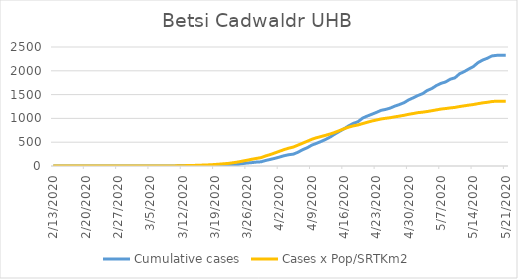
| Category | Cumulative cases | Cases x Pop/SRTKm2 |
|---|---|---|
| 5/21/20 | 2327 | 1361.976 |
| 5/20/20 | 2327 | 1361.976 |
| 5/19/20 | 2324 | 1361.656 |
| 5/18/20 | 2312 | 1354.191 |
| 5/17/20 | 2263 | 1338.301 |
| 5/16/20 | 2225 | 1326.463 |
| 5/15/20 | 2171 | 1309.826 |
| 5/14/20 | 2089 | 1291.377 |
| 5/13/20 | 2038 | 1278.579 |
| 5/12/20 | 1982 | 1263.862 |
| 5/11/20 | 1937 | 1249.251 |
| 5/10/20 | 1852 | 1231.122 |
| 5/9/20 | 1824 | 1220.564 |
| 5/8/20 | 1766 | 1207.34 |
| 5/7/20 | 1737 | 1196.675 |
| 5/6/20 | 1691 | 1179.078 |
| 5/5/20 | 1628 | 1161.482 |
| 5/4/20 | 1586 | 1144.525 |
| 5/3/20 | 1520 | 1130.874 |
| 5/2/20 | 1481 | 1120.85 |
| 5/1/20 | 1434 | 1103.04 |
| 4/30/20 | 1390 | 1086.19 |
| 4/29/20 | 1331 | 1065.714 |
| 4/28/20 | 1292 | 1048.33 |
| 4/27/20 | 1259 | 1032.76 |
| 4/26/20 | 1217 | 1015.27 |
| 4/25/20 | 1189 | 1002.579 |
| 4/24/20 | 1169 | 988.182 |
| 4/23/20 | 1126 | 966.106 |
| 4/22/20 | 1087 | 944.99 |
| 4/21/20 | 1049 | 918.222 |
| 4/20/20 | 1006 | 891.241 |
| 4/19/20 | 930 | 861.913 |
| 4/18/20 | 896 | 842.93 |
| 4/17/20 | 844 | 817.015 |
| 4/16/20 | 783 | 782.675 |
| 4/15/20 | 727 | 744.389 |
| 4/14/20 | 672 | 706.53 |
| 4/13/20 | 610 | 673.47 |
| 4/12/20 | 558 | 644.995 |
| 4/11/20 | 515 | 619.08 |
| 4/10/20 | 475 | 593.059 |
| 4/9/20 | 439 | 561.065 |
| 4/8/20 | 383 | 519.473 |
| 4/7/20 | 342 | 478.627 |
| 4/6/20 | 289 | 438.528 |
| 4/5/20 | 249 | 398.11 |
| 4/4/20 | 237 | 374.541 |
| 4/3/20 | 216 | 344.573 |
| 4/2/20 | 188 | 310.02 |
| 4/1/20 | 161 | 274.507 |
| 3/31/20 | 138 | 240.38 |
| 3/30/20 | 116 | 211.479 |
| 3/29/20 | 88 | 175.859 |
| 3/28/20 | 82 | 159.223 |
| 3/27/20 | 71 | 141.519 |
| 3/26/20 | 63 | 121.79 |
| 3/25/20 | 50 | 103.233 |
| 3/24/20 | 32 | 83.717 |
| 3/23/20 | 22 | 69.32 |
| 3/22/20 | 20 | 55.456 |
| 3/21/20 | 16 | 47.351 |
| 3/20/20 | 12 | 39.352 |
| 3/19/20 | 11 | 31.674 |
| 3/18/20 | 9 | 25.275 |
| 3/17/20 | 7 | 21.542 |
| 3/16/20 | 7 | 17.597 |
| 3/15/20 | 6 | 13.971 |
| 3/14/20 | 6 | 10.878 |
| 3/13/20 | 4 | 8.852 |
| 3/12/20 | 4 | 5.972 |
| 3/11/20 | 3 | 3.413 |
| 3/10/20 | 1 | 1.92 |
| 3/9/20 | 0 | 0.747 |
| 3/8/20 | 0 | 0.427 |
| 3/7/20 | 0 | 0.427 |
| 3/6/20 | 0 | 0.213 |
| 3/5/20 | 0 | 0.213 |
| 3/4/20 | 0 | 0.213 |
| 3/3/20 | 0 | 0.107 |
| 3/2/20 | 0 | 0.107 |
| 3/1/20 | 0 | 0.107 |
| 2/29/20 | 0 | 0.107 |
| 2/28/20 | 0 | 0.107 |
| 2/27/20 | 0 | 0.107 |
| 2/26/20 | 0 | 0 |
| 2/25/20 | 0 | 0 |
| 2/24/20 | 0 | 0 |
| 2/23/20 | 0 | 0 |
| 2/22/20 | 0 | 0 |
| 2/21/20 | 0 | 0 |
| 2/20/20 | 0 | 0 |
| 2/19/20 | 0 | 0 |
| 2/18/20 | 0 | 0 |
| 2/17/20 | 0 | 0 |
| 2/16/20 | 0 | 0 |
| 2/15/20 | 0 | 0 |
| 2/14/20 | 0 | 0 |
| 2/13/20 | 0 | 0 |